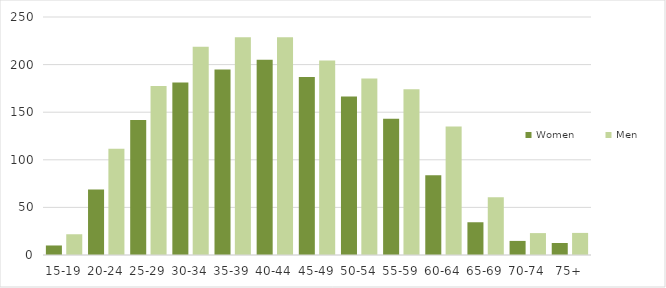
| Category | Women | Men |
|---|---|---|
| 15-19 | 10 | 21.8 |
| 20-24 | 68.7 | 111.6 |
| 25-29 | 141.8 | 177.6 |
| 30-34 | 181.3 | 218.7 |
| 35-39 | 194.9 | 228.6 |
| 40-44 | 205.1 | 228.8 |
| 45-49 | 187 | 204.4 |
| 50-54 | 166.4 | 185.3 |
| 55-59 | 143.1 | 174 |
| 60-64 | 83.9 | 135.1 |
| 65-69 | 34.4 | 60.6 |
| 70-74 | 14.8 | 23 |
| 75+ | 12.6 | 23.2 |